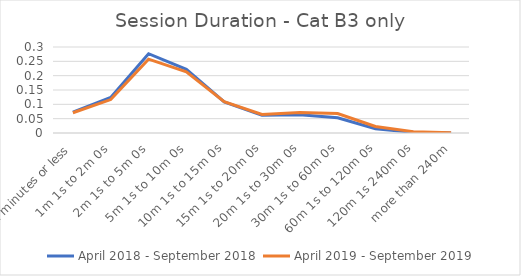
| Category | April 2018 - September 2018 | April 2019 - September 2019 |
|---|---|---|
| 1 minutes or less | 0.073 | 0.071 |
| 1m 1s to 2m 0s | 0.124 | 0.117 |
| 2m 1s to 5m 0s | 0.277 | 0.257 |
| 5m 1s to 10m 0s | 0.222 | 0.213 |
| 10m 1s to 15m 0s | 0.109 | 0.109 |
| 15m 1s to 20m 0s | 0.062 | 0.065 |
| 20m 1s to 30m 0s | 0.063 | 0.071 |
| 30m 1s to 60m 0s | 0.053 | 0.068 |
| 60m 1s to 120m 0s | 0.015 | 0.023 |
| 120m 1s 240m 0s | 0.002 | 0.005 |
| more than 240m | 0 | 0 |